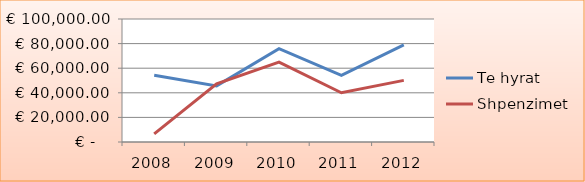
| Category | Te hyrat | Shpenzimet |
|---|---|---|
| 2008.0 | 54200 | 6542 |
| 2009.0 | 45600 | 47300 |
| 2010.0 | 75900 | 65000 |
| 2011.0 | 54100 | 40000 |
| 2012.0 | 79000 | 50100 |